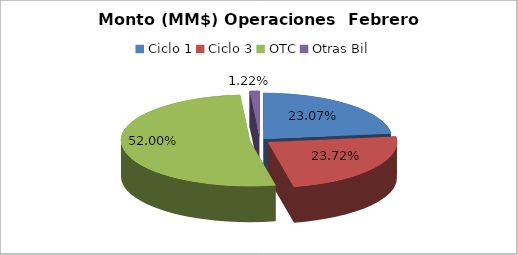
| Category | Series 0 |
|---|---|
| Ciclo 1 | 13675521.943 |
| Ciclo 3 | 14060199.134 |
| OTC | 30828680.35 |
| Otras Bil | 721919.806 |